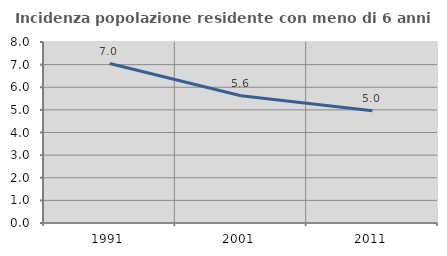
| Category | Incidenza popolazione residente con meno di 6 anni |
|---|---|
| 1991.0 | 7.048 |
| 2001.0 | 5.622 |
| 2011.0 | 4.963 |